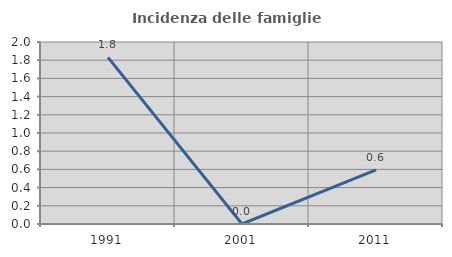
| Category | Incidenza delle famiglie numerose |
|---|---|
| 1991.0 | 1.832 |
| 2001.0 | 0 |
| 2011.0 | 0.595 |